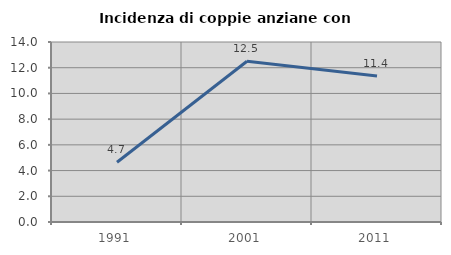
| Category | Incidenza di coppie anziane con figli |
|---|---|
| 1991.0 | 4.651 |
| 2001.0 | 12.5 |
| 2011.0 | 11.364 |